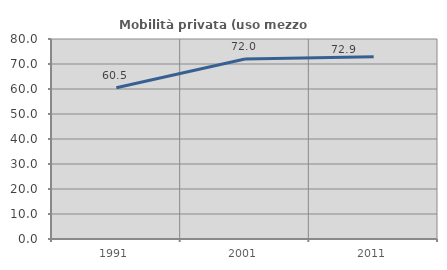
| Category | Mobilità privata (uso mezzo privato) |
|---|---|
| 1991.0 | 60.512 |
| 2001.0 | 72.02 |
| 2011.0 | 72.858 |